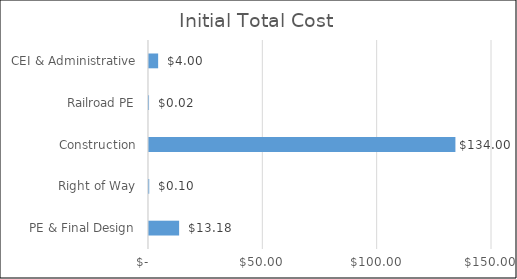
| Category | Initial Total Cost |
|---|---|
| PE & Final Design | 13.176 |
| Right of Way | 0.1 |
| Construction | 134 |
| Railroad PE | 0.02 |
| CEI & Administrative | 4 |